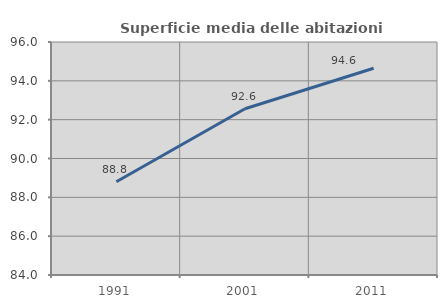
| Category | Superficie media delle abitazioni occupate |
|---|---|
| 1991.0 | 88.805 |
| 2001.0 | 92.561 |
| 2011.0 | 94.645 |